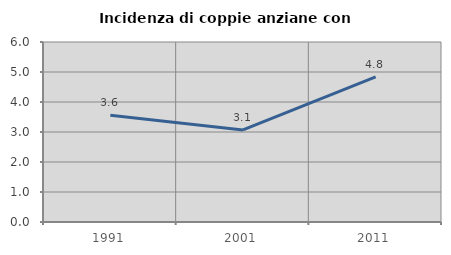
| Category | Incidenza di coppie anziane con figli |
|---|---|
| 1991.0 | 3.561 |
| 2001.0 | 3.068 |
| 2011.0 | 4.835 |